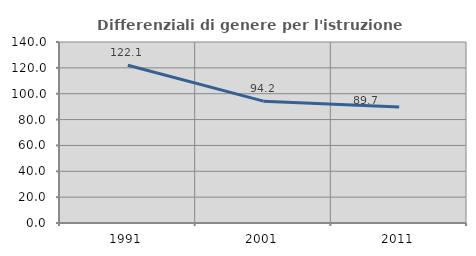
| Category | Differenziali di genere per l'istruzione superiore |
|---|---|
| 1991.0 | 122.068 |
| 2001.0 | 94.237 |
| 2011.0 | 89.716 |